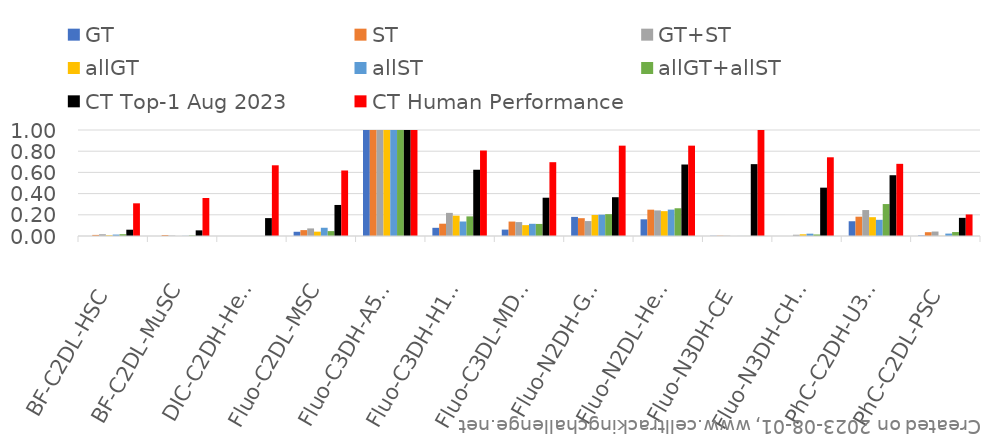
| Category | GT | ST | GT+ST | allGT | allST | allGT+allST | CT Top-1 Aug 2023 | CT Human Performance |
|---|---|---|---|---|---|---|---|---|
| BF-C2DL-HSC | 0 | 0.01 | 0.017 | 0.006 | 0.013 | 0.017 | 0.059 | 0.308 |
| BF-C2DL-MuSC | 0 | 0.01 | 0.004 | 0 | 0.001 | 0.005 | 0.053 | 0.358 |
| DIC-C2DH-HeLa | 0 | 0 | 0 | 0 | 0 | 0 | 0.169 | 0.667 |
| Fluo-C2DL-MSC | 0.04 | 0.056 | 0.072 | 0.041 | 0.078 | 0.046 | 0.293 | 0.618 |
| Fluo-C3DH-A549 | 1 | 1 | 1 | 1 | 1 | 1 | 1 | 1 |
| Fluo-C3DH-H157 | 0.077 | 0.116 | 0.218 | 0.192 | 0.137 | 0.185 | 0.625 | 0.806 |
| Fluo-C3DL-MDA231 | 0.06 | 0.136 | 0.131 | 0.103 | 0.115 | 0.114 | 0.361 | 0.696 |
| Fluo-N2DH-GOWT1 | 0.18 | 0.168 | 0.141 | 0.198 | 0.201 | 0.206 | 0.366 | 0.852 |
| Fluo-N2DL-HeLa | 0.157 | 0.248 | 0.241 | 0.234 | 0.249 | 0.262 | 0.674 | 0.852 |
| Fluo-N3DH-CE | 0.002 | 0.003 | 0.003 | 0 | 0.001 | 0.001 | 0.678 | 1 |
| Fluo-N3DH-CHO | 0 | 0 | 0.012 | 0.016 | 0.022 | 0.014 | 0.456 | 0.743 |
| PhC-C2DH-U373 | 0.139 | 0.182 | 0.245 | 0.178 | 0.153 | 0.301 | 0.573 | 0.681 |
| PhC-C2DL-PSC | 0.005 | 0.036 | 0.042 | 0.001 | 0.023 | 0.037 | 0.171 | 0.203 |